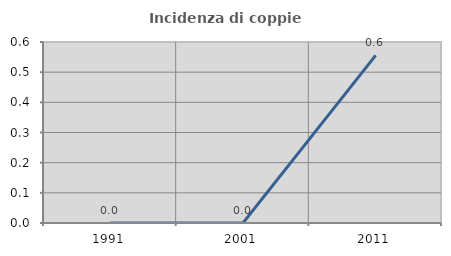
| Category | Incidenza di coppie miste |
|---|---|
| 1991.0 | 0 |
| 2001.0 | 0 |
| 2011.0 | 0.556 |